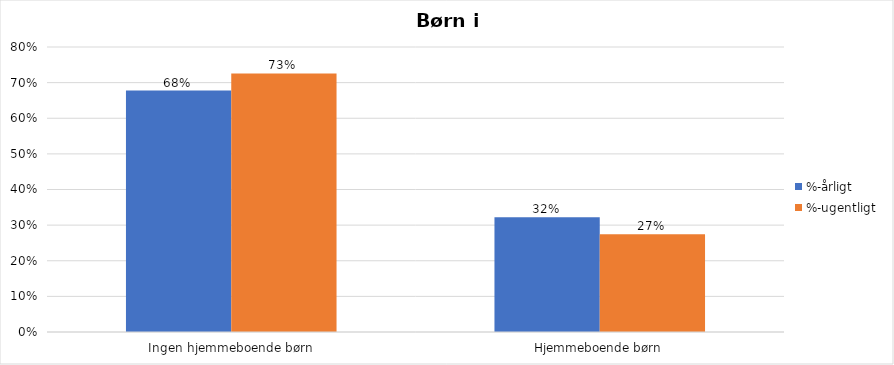
| Category | %-årligt | %-ugentligt |
|---|---|---|
| Ingen hjemmeboende børn | 0.678 | 0.726 |
| Hjemmeboende børn | 0.322 | 0.274 |